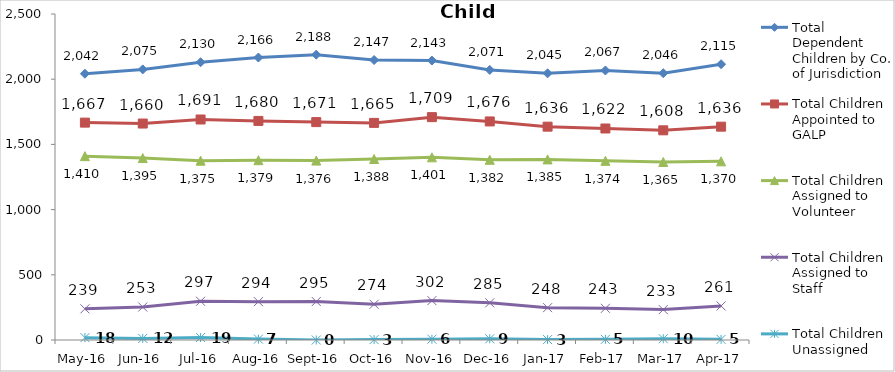
| Category | Total Dependent Children by Co. of Jurisdiction | Total Children Appointed to GALP | Total Children Assigned to Volunteer | Total Children Assigned to Staff | Total Children Unassigned |
|---|---|---|---|---|---|
| May-16 | 2042 | 1667 | 1410 | 239 | 18 |
| Jun-16 | 2075 | 1660 | 1395 | 253 | 12 |
| Jul-16 | 2130 | 1691 | 1375 | 297 | 19 |
| Aug-16 | 2166 | 1680 | 1379 | 294 | 7 |
| Sep-16 | 2188 | 1671 | 1376 | 295 | 0 |
| Oct-16 | 2147 | 1665 | 1388 | 274 | 3 |
| Nov-16 | 2143 | 1709 | 1401 | 302 | 6 |
| Dec-16 | 2071 | 1676 | 1382 | 285 | 9 |
| Jan-17 | 2045 | 1636 | 1385 | 248 | 3 |
| Feb-17 | 2067 | 1622 | 1374 | 243 | 5 |
| Mar-17 | 2046 | 1608 | 1365 | 233 | 10 |
| Apr-17 | 2115 | 1636 | 1370 | 261 | 5 |